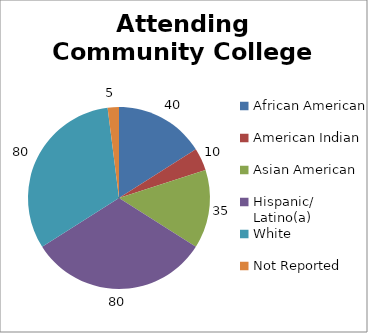
| Category | Number of Students Attending Community College |
|---|---|
| African American | 40 |
| American Indian | 10 |
| Asian American | 35 |
| Hispanic/ Latino(a) | 80 |
| White | 80 |
| Not Reported | 5 |